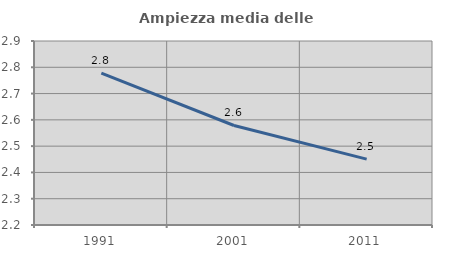
| Category | Ampiezza media delle famiglie |
|---|---|
| 1991.0 | 2.778 |
| 2001.0 | 2.579 |
| 2011.0 | 2.451 |